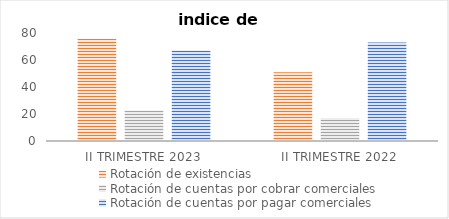
| Category | Rotación de existencias | Rotación de cuentas por cobrar comerciales | Rotación de cuentas por pagar comerciales |
|---|---|---|---|
| II TRIMESTRE 2023 | 75.694 | 22.56 | 67 |
| II TRIMESTRE 2022 | 51 | 17 | 73 |